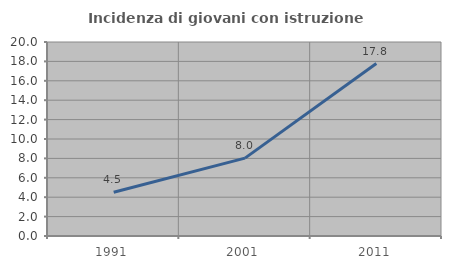
| Category | Incidenza di giovani con istruzione universitaria |
|---|---|
| 1991.0 | 4.504 |
| 2001.0 | 8.029 |
| 2011.0 | 17.778 |